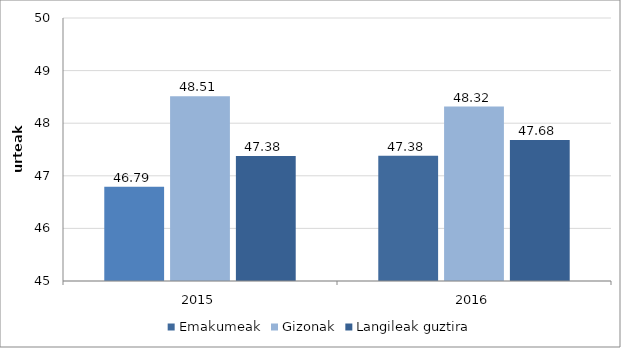
| Category | Emakumeak | Gizonak | Langileak guztira |
|---|---|---|---|
| 2015.0 | 46.791 | 48.515 | 47.375 |
| 2016.0 | 47.383 | 48.317 | 47.683 |